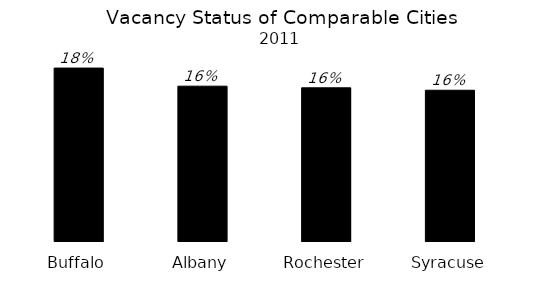
| Category | Series 0 |
|---|---|
| Buffalo | 0.178 |
| Albany | 0.16 |
| Rochester | 0.158 |
| Syracuse | 0.155 |